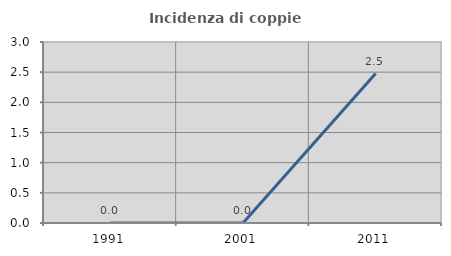
| Category | Incidenza di coppie miste |
|---|---|
| 1991.0 | 0 |
| 2001.0 | 0 |
| 2011.0 | 2.477 |